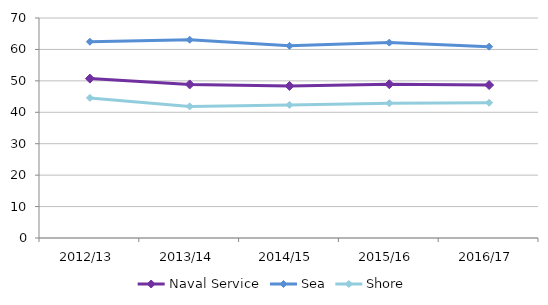
| Category | Naval Service | Sea | Shore |
|---|---|---|---|
| 2012/13 | 50.718 | 62.448 | 44.582 |
| 2013/14 | 48.862 | 63.089 | 41.878 |
| 2014/15 | 48.381 | 61.159 | 42.356 |
| 2015/16 | 48.924 | 62.165 | 42.899 |
| 2016/17 | 48.666 | 60.881 | 43.031 |